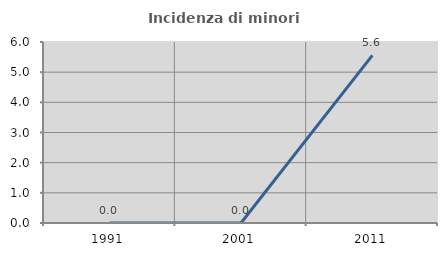
| Category | Incidenza di minori stranieri |
|---|---|
| 1991.0 | 0 |
| 2001.0 | 0 |
| 2011.0 | 5.556 |